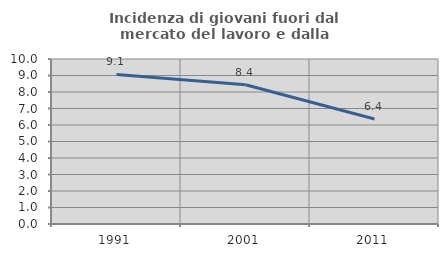
| Category | Incidenza di giovani fuori dal mercato del lavoro e dalla formazione  |
|---|---|
| 1991.0 | 9.065 |
| 2001.0 | 8.438 |
| 2011.0 | 6.36 |